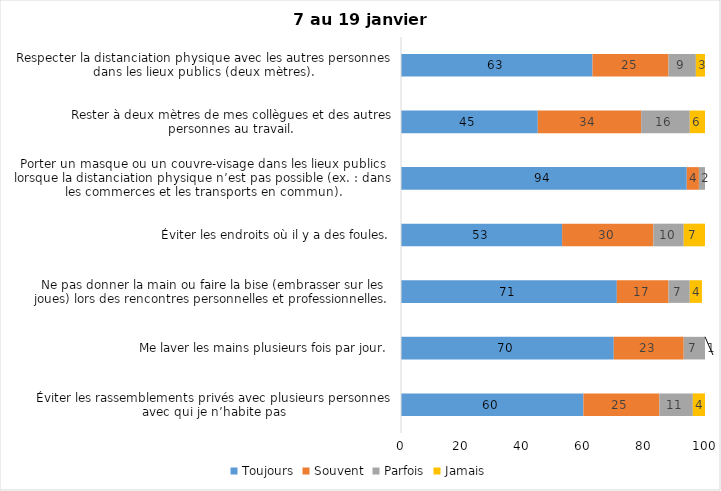
| Category | Toujours | Souvent | Parfois | Jamais |
|---|---|---|---|---|
| Éviter les rassemblements privés avec plusieurs personnes avec qui je n’habite pas | 60 | 25 | 11 | 4 |
| Me laver les mains plusieurs fois par jour. | 70 | 23 | 7 | 1 |
| Ne pas donner la main ou faire la bise (embrasser sur les joues) lors des rencontres personnelles et professionnelles. | 71 | 17 | 7 | 4 |
| Éviter les endroits où il y a des foules. | 53 | 30 | 10 | 7 |
| Porter un masque ou un couvre-visage dans les lieux publics lorsque la distanciation physique n’est pas possible (ex. : dans les commerces et les transports en commun). | 94 | 4 | 2 | 0 |
| Rester à deux mètres de mes collègues et des autres personnes au travail. | 45 | 34 | 16 | 6 |
| Respecter la distanciation physique avec les autres personnes dans les lieux publics (deux mètres). | 63 | 25 | 9 | 3 |